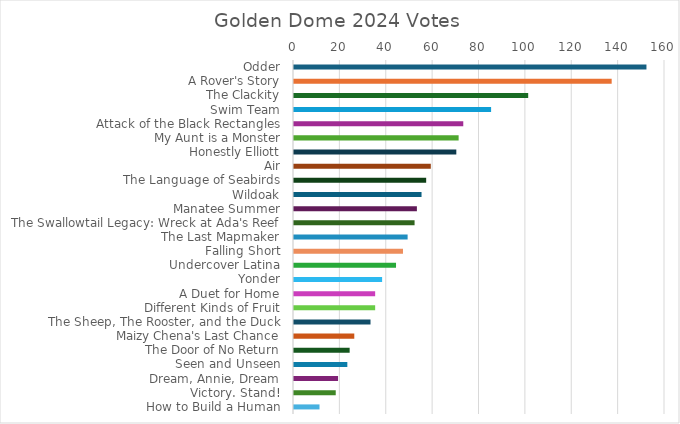
| Category | Votes |
|---|---|
| Odder | 152 |
| A Rover's Story | 137 |
| The Clackity | 101 |
| Swim Team | 85 |
| Attack of the Black Rectangles | 73 |
| My Aunt is a Monster | 71 |
| Honestly Elliott | 70 |
| Air | 59 |
| The Language of Seabirds | 57 |
| Wildoak | 55 |
| Manatee Summer | 53 |
| The Swallowtail Legacy: Wreck at Ada's Reef | 52 |
| The Last Mapmaker | 49 |
| Falling Short | 47 |
| Undercover Latina | 44 |
| Yonder | 38 |
| A Duet for Home | 35 |
| Different Kinds of Fruit | 35 |
| The Sheep, The Rooster, and the Duck | 33 |
| Maizy Chena's Last Chance | 26 |
| The Door of No Return | 24 |
| Seen and Unseen | 23 |
| Dream, Annie, Dream | 19 |
| Victory. Stand! | 18 |
| How to Build a Human | 11 |